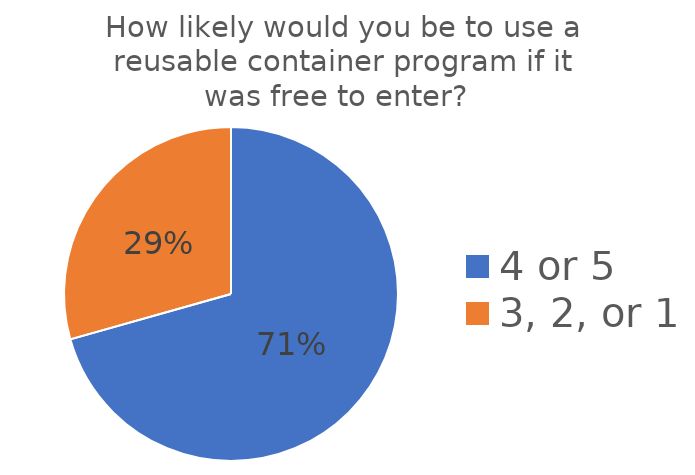
| Category | Series 0 |
|---|---|
| 4 or 5 | 125 |
| 3, 2, or 1 | 52 |